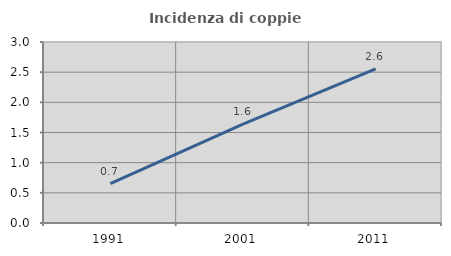
| Category | Incidenza di coppie miste |
|---|---|
| 1991.0 | 0.652 |
| 2001.0 | 1.64 |
| 2011.0 | 2.555 |